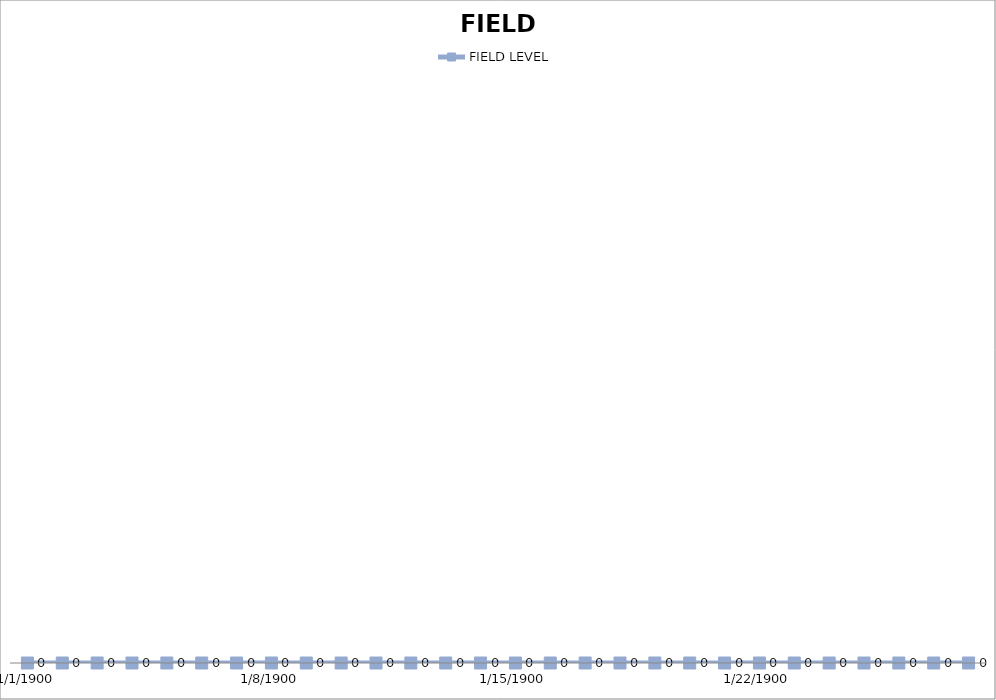
| Category | FIELD LEVEL |
|---|---|
| 0 | 0 |
| 1 | 0 |
| 2 | 0 |
| 3 | 0 |
| 4 | 0 |
| 5 | 0 |
| 6 | 0 |
| 7 | 0 |
| 8 | 0 |
| 9 | 0 |
| 10 | 0 |
| 11 | 0 |
| 12 | 0 |
| 13 | 0 |
| 14 | 0 |
| 15 | 0 |
| 16 | 0 |
| 17 | 0 |
| 18 | 0 |
| 19 | 0 |
| 20 | 0 |
| 21 | 0 |
| 22 | 0 |
| 23 | 0 |
| 24 | 0 |
| 25 | 0 |
| 26 | 0 |
| 27 | 0 |